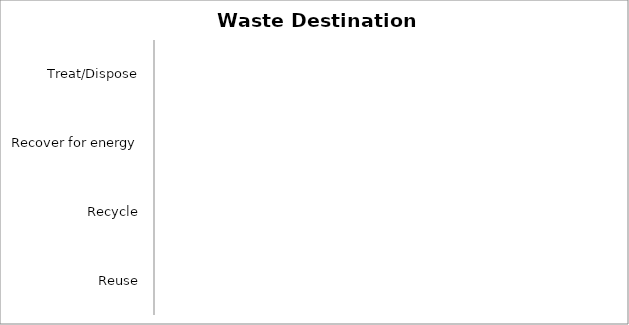
| Category | Waste diverted from landfill | Waste sent to landfill |
|---|---|---|
| Waste destination
% by weight of waste generated | 0 | 0 |